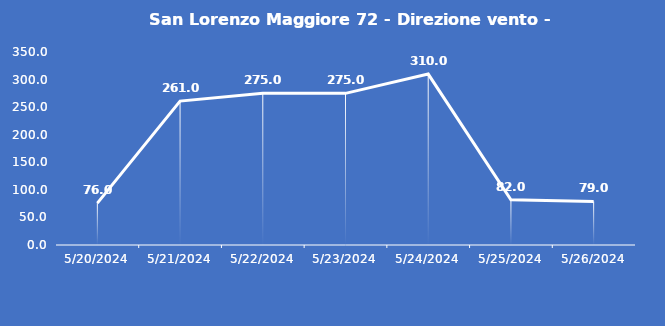
| Category | San Lorenzo Maggiore 72 - Direzione vento - Grezzo (°N) |
|---|---|
| 5/20/24 | 76 |
| 5/21/24 | 261 |
| 5/22/24 | 275 |
| 5/23/24 | 275 |
| 5/24/24 | 310 |
| 5/25/24 | 82 |
| 5/26/24 | 79 |